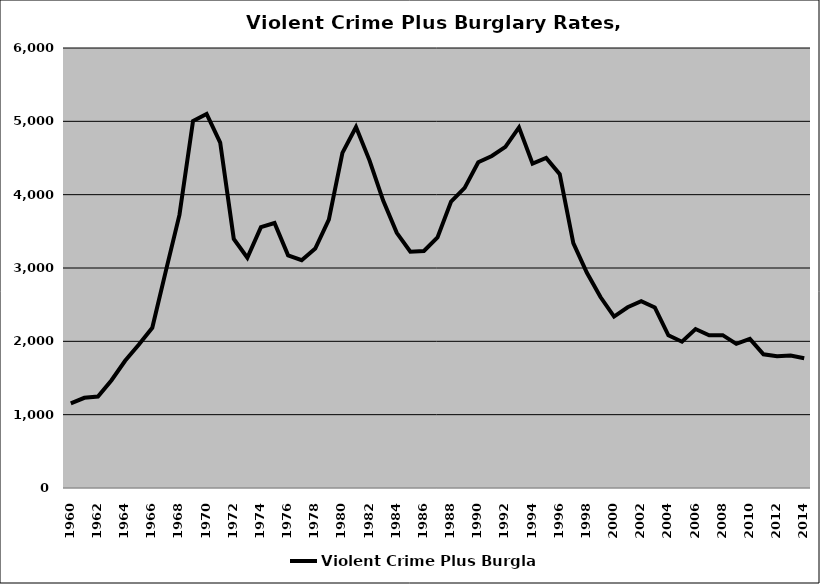
| Category | Violent Crime Plus Burglary |
|---|---|
| 1960.0 | 1154.124 |
| 1961.0 | 1229.521 |
| 1962.0 | 1246.429 |
| 1963.0 | 1469.173 |
| 1964.0 | 1735.396 |
| 1965.0 | 1953.923 |
| 1966.0 | 2184.777 |
| 1967.0 | 2960.939 |
| 1968.0 | 3724.351 |
| 1969.0 | 5005.013 |
| 1970.0 | 5100.527 |
| 1971.0 | 4710.121 |
| 1972.0 | 3396.791 |
| 1973.0 | 3140.349 |
| 1974.0 | 3556.846 |
| 1975.0 | 3612.849 |
| 1976.0 | 3172.08 |
| 1977.0 | 3106.232 |
| 1978.0 | 3265.875 |
| 1979.0 | 3659.299 |
| 1980.0 | 4570.292 |
| 1981.0 | 4921.384 |
| 1982.0 | 4464.501 |
| 1983.0 | 3919.101 |
| 1984.0 | 3479.775 |
| 1985.0 | 3223.003 |
| 1986.0 | 3232.907 |
| 1987.0 | 3418.006 |
| 1988.0 | 3905.484 |
| 1989.0 | 4092.219 |
| 1990.0 | 4441.259 |
| 1991.0 | 4527.759 |
| 1992.0 | 4652.971 |
| 1993.0 | 4917.301 |
| 1994.0 | 4423.509 |
| 1995.0 | 4499.819 |
| 1996.0 | 4279.742 |
| 1997.0 | 3340.454 |
| 1998.0 | 2934.799 |
| 1999.0 | 2604.046 |
| 2000.0 | 2337.346 |
| 2001.0 | 2464.876 |
| 2002.0 | 2546.222 |
| 2003.0 | 2462.609 |
| 2004.0 | 2081.413 |
| 2005.0 | 1994.506 |
| 2006.0 | 2167.902 |
| 2007.0 | 2082.469 |
| 2008.0 | 2083.976 |
| 2009.0 | 1965.29 |
| 2010.0 | 2033.328 |
| 2011.0 | 1822.72 |
| 2012.0 | 1797.366 |
| 2013.0 | 1807.241 |
| 2014.0 | 1770.394 |